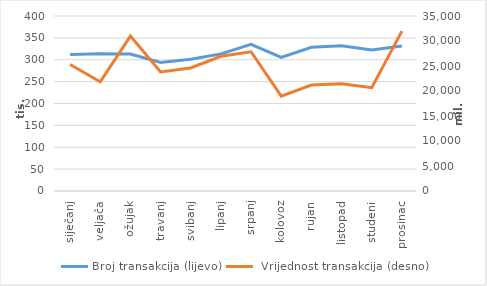
| Category | Broj transakcija (lijevo) |
|---|---|
| siječanj | 311936 |
| veljača | 313890 |
| ožujak | 313019 |
| travanj | 293685 |
| svibanj | 301199 |
| lipanj | 313360 |
| srpanj | 335286 |
| kolovoz | 305464 |
| rujan | 328642 |
| listopad | 331729 |
| studeni | 322245 |
| prosinac | 331409 |